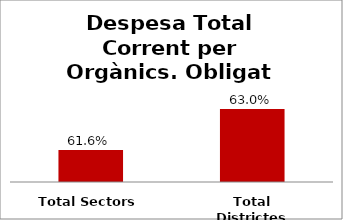
| Category | Series 0 |
|---|---|
| Total Sectors | 0.616 |
| Total Districtes | 0.63 |